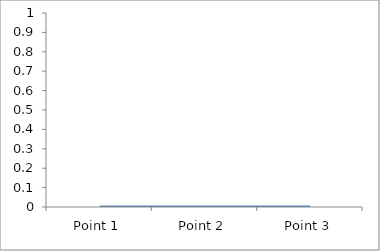
| Category | Series 8 |
|---|---|
| Point 1 | 0 |
| Point 2 | 0 |
| Point 3 | 0 |